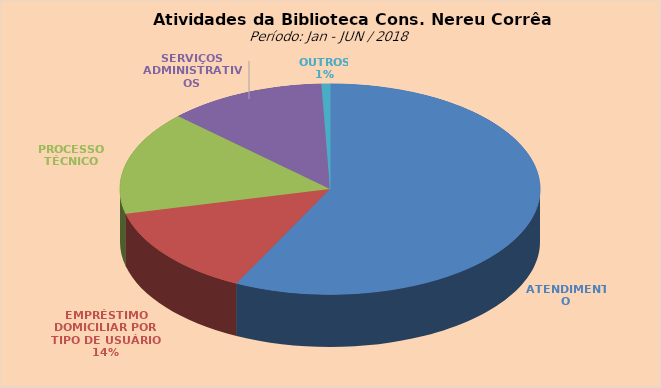
| Category | Series 0 |
|---|---|
| ATENDIMENTO | 6656 |
| EMPRÉSTIMO DOMICILIAR POR TIPO DE USUÁRIO | 1611 |
| PROCESSO TÉCNICO | 1851 |
| SERVIÇOS ADMINISTRATIVOS | 1413 |
| OUTROS | 76 |